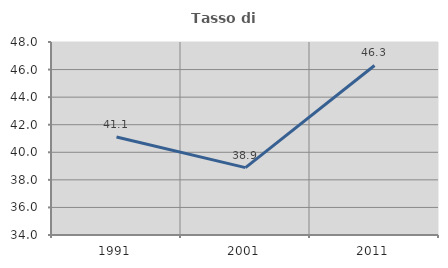
| Category | Tasso di occupazione   |
|---|---|
| 1991.0 | 41.107 |
| 2001.0 | 38.889 |
| 2011.0 | 46.299 |